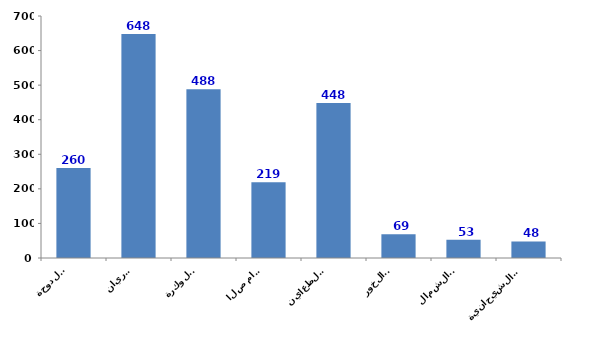
| Category | Series 0 |
|---|---|
| الدوحة
Doha | 260 |
| الريان
Rayyan | 648 |
| الوكرة
Wakrah | 488 |
| ام صلال
Umm Slal | 219 |
| الظعاين
Al-Daayen | 448 |
| الخور
Al-Khor | 69 |
| الشمال
Al-Shamal | 53 |
| الشيحانية
Al-Shahhaniya  | 48 |